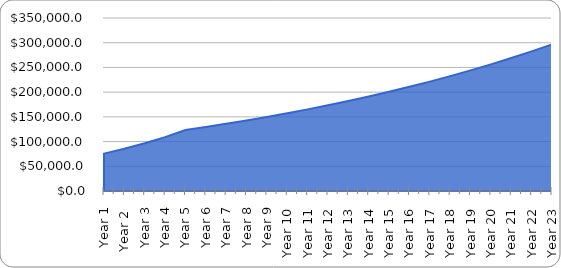
| Category | Series 0 |
|---|---|
| Year 1 | 75585.7 |
| Year 2  | 85411.841 |
| Year 3 | 96515.38 |
| Year 4 | 109062.38 |
| Year 5 | 123240.489 |
| Year 6 | 129402.514 |
| Year 7 | 135872.639 |
| Year 8 | 142666.271 |
| Year 9 | 149799.585 |
| Year 10 | 157289.564 |
| Year 11 | 165154.042 |
| Year 12 | 173411.744 |
| Year 13 | 182082.332 |
| Year 14 | 191186.448 |
| Year 15 | 200745.771 |
| Year 16 | 210783.059 |
| Year 17 | 221322.212 |
| Year 18 | 232388.323 |
| Year 19 | 244007.739 |
| Year 20 | 256208.126 |
| Year 21 | 269018.532 |
| Year 22 | 282469.459 |
| Year 23 | 296592.932 |